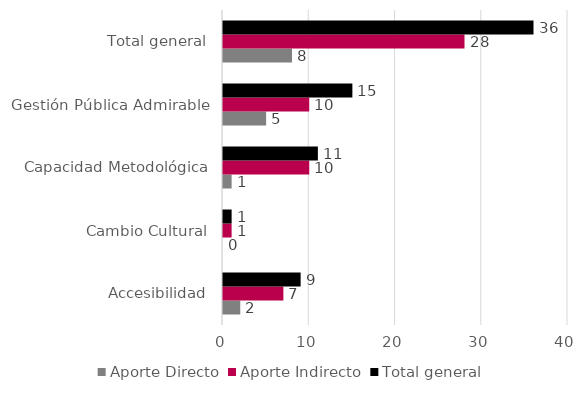
| Category | Aporte Directo | Aporte Indirecto | Total general |
|---|---|---|---|
| Accesibilidad | 2 | 7 | 9 |
| Cambio Cultural | 0 | 1 | 1 |
| Capacidad Metodológica | 1 | 10 | 11 |
| Gestión Pública Admirable | 5 | 10 | 15 |
| Total general | 8 | 28 | 36 |